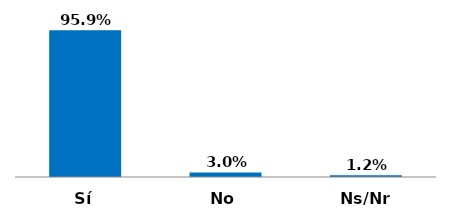
| Category | Series 0 |
|---|---|
| Sí | 0.959 |
| No | 0.03 |
| Ns/Nr | 0.012 |